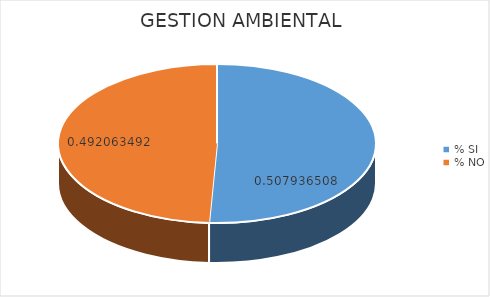
| Category | Series 0 |
|---|---|
| % SI | 0.508 |
| % NO | 0.492 |